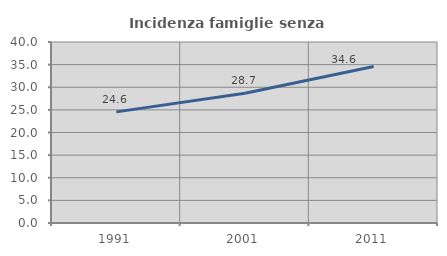
| Category | Incidenza famiglie senza nuclei |
|---|---|
| 1991.0 | 24.561 |
| 2001.0 | 28.694 |
| 2011.0 | 34.565 |